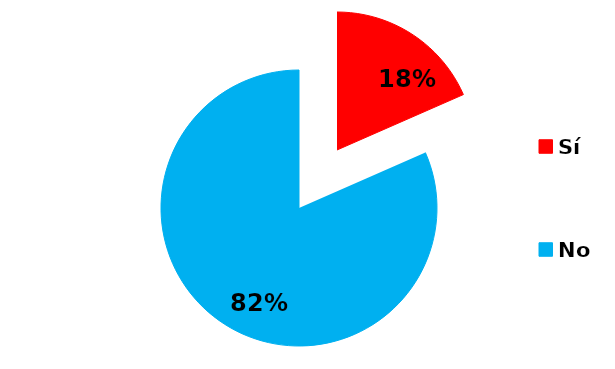
| Category | Series 0 |
|---|---|
| Sí | 7 |
| No | 31 |